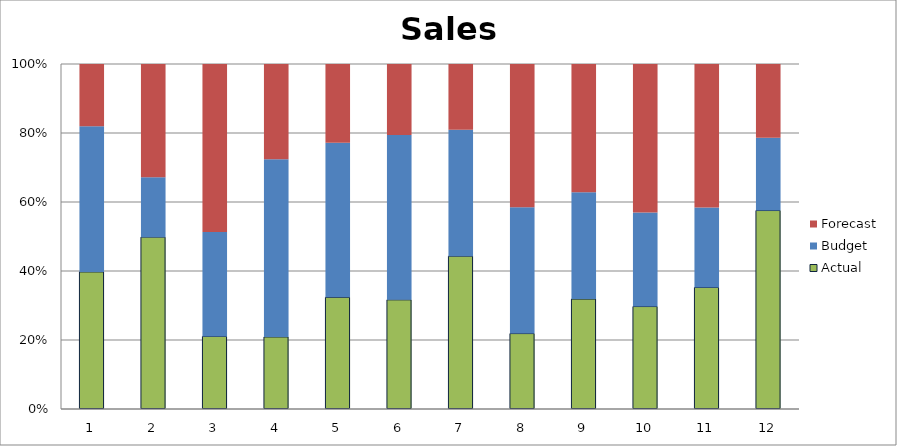
| Category | Actual | Budget | Forecast |
|---|---|---|---|
| 0 | 3170 | 3370 | 1440 |
| 1 | 2670 | 930 | 1760 |
| 2 | 1140 | 1640 | 2640 |
| 3 | 810 | 2000 | 1070 |
| 4 | 1220 | 1690 | 860 |
| 5 | 1740 | 2630 | 1130 |
| 6 | 3370 | 2790 | 1450 |
| 7 | 1200 | 2010 | 2280 |
| 8 | 1800 | 1750 | 2100 |
| 9 | 1360 | 1250 | 1970 |
| 10 | 2860 | 1880 | 3380 |
| 11 | 1720 | 630 | 640 |